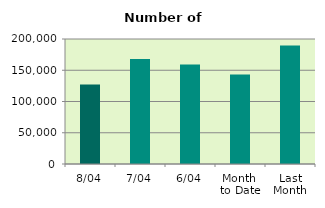
| Category | Series 0 |
|---|---|
| 8/04 | 127308 |
| 7/04 | 167966 |
| 6/04 | 159210 |
| Month 
to Date | 143334 |
| Last
Month | 189416.87 |